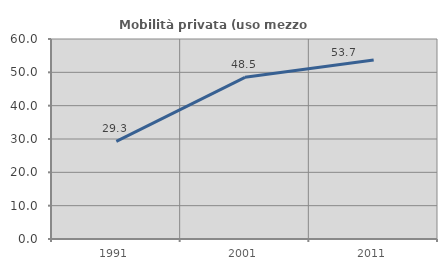
| Category | Mobilità privata (uso mezzo privato) |
|---|---|
| 1991.0 | 29.264 |
| 2001.0 | 48.511 |
| 2011.0 | 53.71 |